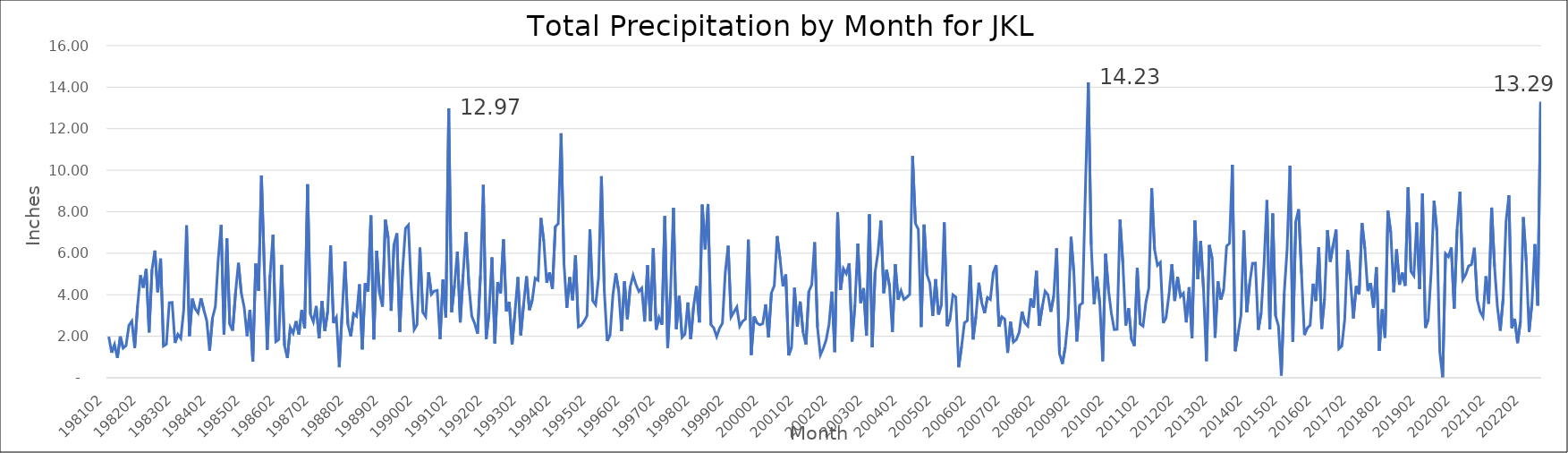
| Category | monthly_total |
|---|---|
| 198102.0 | 1.98 |
| 198103.0 | 1.21 |
| 198104.0 | 1.6 |
| 198105.0 | 0.96 |
| 198106.0 | 1.99 |
| 198107.0 | 1.43 |
| 198108.0 | 1.55 |
| 198109.0 | 2.53 |
| 198110.0 | 2.73 |
| 198111.0 | 1.44 |
| 198112.0 | 3.48 |
| 198201.0 | 4.94 |
| 198202.0 | 4.34 |
| 198203.0 | 5.24 |
| 198204.0 | 2.19 |
| 198205.0 | 5.2 |
| 198206.0 | 6.13 |
| 198207.0 | 4.12 |
| 198208.0 | 5.74 |
| 198209.0 | 1.53 |
| 198210.0 | 1.62 |
| 198211.0 | 3.62 |
| 198212.0 | 3.63 |
| 198301.0 | 1.68 |
| 198302.0 | 2.09 |
| 198303.0 | 1.9 |
| 198304.0 | 3.25 |
| 198305.0 | 7.34 |
| 198306.0 | 2.01 |
| 198307.0 | 3.81 |
| 198308.0 | 3.33 |
| 198309.0 | 3.12 |
| 198310.0 | 3.83 |
| 198311.0 | 3.27 |
| 198312.0 | 2.76 |
| 198401.0 | 1.31 |
| 198402.0 | 2.88 |
| 198403.0 | 3.43 |
| 198404.0 | 5.72 |
| 198405.0 | 7.36 |
| 198406.0 | 2.09 |
| 198407.0 | 6.71 |
| 198408.0 | 2.58 |
| 198409.0 | 2.27 |
| 198410.0 | 4.09 |
| 198411.0 | 5.54 |
| 198412.0 | 4.08 |
| 198501.0 | 3.4 |
| 198502.0 | 2.01 |
| 198503.0 | 3.27 |
| 198504.0 | 0.78 |
| 198505.0 | 5.5 |
| 198506.0 | 4.19 |
| 198507.0 | 9.74 |
| 198508.0 | 5.24 |
| 198509.0 | 1.35 |
| 198510.0 | 4.97 |
| 198511.0 | 6.89 |
| 198512.0 | 1.74 |
| 198601.0 | 1.84 |
| 198602.0 | 5.44 |
| 198603.0 | 1.56 |
| 198604.0 | 0.95 |
| 198605.0 | 2.42 |
| 198606.0 | 2.15 |
| 198607.0 | 2.73 |
| 198608.0 | 2.09 |
| 198609.0 | 3.27 |
| 198610.0 | 2.38 |
| 198611.0 | 9.32 |
| 198612.0 | 3.06 |
| 198701.0 | 2.7 |
| 198702.0 | 3.46 |
| 198703.0 | 1.9 |
| 198704.0 | 3.69 |
| 198705.0 | 2.25 |
| 198706.0 | 3.22 |
| 198707.0 | 6.37 |
| 198708.0 | 2.64 |
| 198709.0 | 2.91 |
| 198710.0 | 0.51 |
| 198711.0 | 3.15 |
| 198712.0 | 5.6 |
| 198801.0 | 2.57 |
| 198802.0 | 2 |
| 198803.0 | 3.09 |
| 198804.0 | 2.97 |
| 198805.0 | 4.5 |
| 198806.0 | 1.37 |
| 198807.0 | 4.56 |
| 198808.0 | 4.15 |
| 198809.0 | 7.82 |
| 198810.0 | 1.85 |
| 198811.0 | 6.12 |
| 198812.0 | 4.07 |
| 198901.0 | 3.43 |
| 198902.0 | 7.61 |
| 198903.0 | 6.73 |
| 198904.0 | 3.23 |
| 198905.0 | 6.43 |
| 198906.0 | 6.96 |
| 198907.0 | 2.21 |
| 198908.0 | 5.22 |
| 198909.0 | 7.2 |
| 198910.0 | 7.36 |
| 198911.0 | 4.28 |
| 198912.0 | 2.32 |
| 199001.0 | 2.56 |
| 199002.0 | 6.27 |
| 199003.0 | 3.16 |
| 199004.0 | 2.95 |
| 199005.0 | 5.08 |
| 199006.0 | 4.02 |
| 199007.0 | 4.18 |
| 199008.0 | 4.21 |
| 199009.0 | 1.86 |
| 199010.0 | 4.73 |
| 199011.0 | 2.91 |
| 199012.0 | 12.97 |
| 199101.0 | 3.16 |
| 199102.0 | 4.46 |
| 199103.0 | 6.08 |
| 199104.0 | 2.67 |
| 199105.0 | 4.99 |
| 199106.0 | 7.01 |
| 199107.0 | 4.46 |
| 199108.0 | 2.96 |
| 199109.0 | 2.62 |
| 199110.0 | 2.13 |
| 199111.0 | 4.9 |
| 199112.0 | 9.29 |
| 199201.0 | 1.87 |
| 199202.0 | 3.12 |
| 199203.0 | 5.8 |
| 199204.0 | 1.66 |
| 199205.0 | 4.61 |
| 199206.0 | 4.07 |
| 199207.0 | 6.67 |
| 199208.0 | 3.2 |
| 199209.0 | 3.66 |
| 199210.0 | 1.6 |
| 199211.0 | 3.17 |
| 199212.0 | 4.85 |
| 199301.0 | 2.05 |
| 199302.0 | 3.54 |
| 199303.0 | 4.89 |
| 199304.0 | 3.26 |
| 199305.0 | 3.74 |
| 199306.0 | 4.8 |
| 199307.0 | 4.7 |
| 199308.0 | 7.7 |
| 199309.0 | 6.58 |
| 199310.0 | 4.58 |
| 199311.0 | 5.08 |
| 199312.0 | 4.28 |
| 199401.0 | 7.28 |
| 199402.0 | 7.42 |
| 199403.0 | 11.78 |
| 199404.0 | 5.52 |
| 199405.0 | 3.37 |
| 199406.0 | 4.85 |
| 199407.0 | 3.74 |
| 199408.0 | 5.89 |
| 199409.0 | 2.45 |
| 199410.0 | 2.53 |
| 199411.0 | 2.73 |
| 199412.0 | 2.99 |
| 199501.0 | 7.15 |
| 199502.0 | 3.71 |
| 199503.0 | 3.51 |
| 199504.0 | 4.81 |
| 199505.0 | 9.71 |
| 199506.0 | 4.19 |
| 199507.0 | 1.77 |
| 199508.0 | 2.07 |
| 199509.0 | 4.01 |
| 199510.0 | 5.03 |
| 199511.0 | 4.18 |
| 199512.0 | 2.25 |
| 199601.0 | 4.64 |
| 199602.0 | 2.82 |
| 199603.0 | 4.39 |
| 199604.0 | 4.94 |
| 199605.0 | 4.49 |
| 199606.0 | 4.16 |
| 199607.0 | 4.32 |
| 199608.0 | 2.71 |
| 199609.0 | 5.42 |
| 199610.0 | 2.74 |
| 199611.0 | 6.25 |
| 199612.0 | 2.32 |
| 199701.0 | 2.9 |
| 199702.0 | 2.56 |
| 199703.0 | 7.79 |
| 199704.0 | 1.44 |
| 199705.0 | 4.15 |
| 199706.0 | 8.19 |
| 199707.0 | 2.35 |
| 199708.0 | 3.94 |
| 199709.0 | 1.95 |
| 199710.0 | 2.11 |
| 199711.0 | 3.63 |
| 199712.0 | 1.86 |
| 199801.0 | 3.45 |
| 199802.0 | 4.42 |
| 199803.0 | 2.67 |
| 199804.0 | 8.34 |
| 199805.0 | 6.19 |
| 199806.0 | 8.37 |
| 199807.0 | 2.56 |
| 199808.0 | 2.4 |
| 199809.0 | 1.98 |
| 199810.0 | 2.38 |
| 199811.0 | 2.63 |
| 199812.0 | 5.09 |
| 199901.0 | 6.36 |
| 199902.0 | 2.93 |
| 199903.0 | 3.17 |
| 199904.0 | 3.41 |
| 199905.0 | 2.48 |
| 199906.0 | 2.72 |
| 199907.0 | 2.83 |
| 199908.0 | 6.65 |
| 199909.0 | 1.1 |
| 199910.0 | 2.95 |
| 199911.0 | 2.64 |
| 199912.0 | 2.55 |
| 200001.0 | 2.611 |
| 200002.0 | 3.537 |
| 200003.0 | 1.945 |
| 200004.0 | 4.085 |
| 200005.0 | 4.435 |
| 200006.0 | 6.824 |
| 200007.0 | 5.723 |
| 200008.0 | 4.403 |
| 200009.0 | 4.974 |
| 200010.0 | 1.082 |
| 200011.0 | 1.476 |
| 200012.0 | 4.339 |
| 200101.0 | 2.47 |
| 200102.0 | 3.67 |
| 200103.0 | 2.19 |
| 200104.0 | 1.6 |
| 200105.0 | 4.15 |
| 200106.0 | 4.48 |
| 200107.0 | 6.53 |
| 200108.0 | 2.43 |
| 200109.0 | 1.1 |
| 200110.0 | 1.41 |
| 200111.0 | 1.82 |
| 200112.0 | 2.57 |
| 200201.0 | 4.15 |
| 200202.0 | 1.24 |
| 200203.0 | 7.97 |
| 200204.0 | 4.23 |
| 200205.0 | 5.26 |
| 200206.0 | 5.02 |
| 200207.0 | 5.52 |
| 200208.0 | 1.75 |
| 200209.0 | 3.51 |
| 200210.0 | 6.47 |
| 200211.0 | 3.6 |
| 200212.0 | 4.32 |
| 200301.0 | 2.04 |
| 200302.0 | 7.87 |
| 200303.0 | 1.47 |
| 200304.0 | 5.09 |
| 200305.0 | 6.03 |
| 200306.0 | 7.57 |
| 200307.0 | 4.08 |
| 200308.0 | 5.2 |
| 200309.0 | 4.42 |
| 200310.0 | 2.2 |
| 200311.0 | 5.47 |
| 200312.0 | 3.76 |
| 200401.0 | 4.19 |
| 200402.0 | 3.77 |
| 200403.0 | 3.88 |
| 200404.0 | 4.02 |
| 200405.0 | 10.68 |
| 200406.0 | 7.43 |
| 200407.0 | 7.15 |
| 200408.0 | 2.45 |
| 200409.0 | 7.38 |
| 200410.0 | 4.97 |
| 200411.0 | 4.56 |
| 200412.0 | 2.98 |
| 200501.0 | 4.75 |
| 200502.0 | 3.05 |
| 200503.0 | 3.51 |
| 200504.0 | 7.48 |
| 200505.0 | 2.49 |
| 200506.0 | 2.83 |
| 200507.0 | 4 |
| 200508.0 | 3.89 |
| 200509.0 | 0.51 |
| 200510.0 | 1.49 |
| 200511.0 | 2.65 |
| 200512.0 | 2.75 |
| 200601.0 | 5.42 |
| 200602.0 | 1.85 |
| 200603.0 | 2.96 |
| 200604.0 | 4.58 |
| 200605.0 | 3.62 |
| 200606.0 | 3.11 |
| 200607.0 | 3.87 |
| 200608.0 | 3.77 |
| 200609.0 | 5.06 |
| 200610.0 | 5.43 |
| 200611.0 | 2.46 |
| 200612.0 | 2.94 |
| 200701.0 | 2.83 |
| 200702.0 | 1.2 |
| 200703.0 | 2.7 |
| 200704.0 | 1.72 |
| 200705.0 | 1.84 |
| 200706.0 | 2.19 |
| 200707.0 | 3.19 |
| 200708.0 | 2.64 |
| 200709.0 | 2.49 |
| 200710.0 | 3.82 |
| 200711.0 | 3.38 |
| 200712.0 | 5.15 |
| 200801.0 | 2.5 |
| 200802.0 | 3.39 |
| 200803.0 | 4.17 |
| 200804.0 | 4 |
| 200805.0 | 3.18 |
| 200806.0 | 3.94 |
| 200807.0 | 6.24 |
| 200808.0 | 1.16 |
| 200809.0 | 0.67 |
| 200810.0 | 1.47 |
| 200811.0 | 2.87 |
| 200812.0 | 6.79 |
| 200901.0 | 5.04 |
| 200902.0 | 1.75 |
| 200903.0 | 3.5 |
| 200904.0 | 3.6 |
| 200905.0 | 9.11 |
| 200906.0 | 14.23 |
| 200907.0 | 6.42 |
| 200908.0 | 3.55 |
| 200909.0 | 4.88 |
| 200910.0 | 3.56 |
| 200911.0 | 0.8 |
| 200912.0 | 5.97 |
| 201001.0 | 4.24 |
| 201002.0 | 3.11 |
| 201003.0 | 2.32 |
| 201004.0 | 2.33 |
| 201005.0 | 7.62 |
| 201006.0 | 5.52 |
| 201007.0 | 2.52 |
| 201008.0 | 3.35 |
| 201009.0 | 1.85 |
| 201010.0 | 1.53 |
| 201011.0 | 5.3 |
| 201012.0 | 2.59 |
| 201101.0 | 2.49 |
| 201102.0 | 3.65 |
| 201103.0 | 4.32 |
| 201104.0 | 9.14 |
| 201105.0 | 6.18 |
| 201106.0 | 5.42 |
| 201107.0 | 5.56 |
| 201108.0 | 2.64 |
| 201109.0 | 2.91 |
| 201110.0 | 4.01 |
| 201111.0 | 5.47 |
| 201112.0 | 3.7 |
| 201201.0 | 4.862 |
| 201202.0 | 3.917 |
| 201203.0 | 4.075 |
| 201204.0 | 2.665 |
| 201205.0 | 4.364 |
| 201206.0 | 1.912 |
| 201207.0 | 7.574 |
| 201208.0 | 4.753 |
| 201209.0 | 6.583 |
| 201210.0 | 4.245 |
| 201211.0 | 0.802 |
| 201212.0 | 6.397 |
| 201301.0 | 5.735 |
| 201302.0 | 1.928 |
| 201303.0 | 4.641 |
| 201304.0 | 3.764 |
| 201305.0 | 4.255 |
| 201306.0 | 6.344 |
| 201307.0 | 6.476 |
| 201308.0 | 10.263 |
| 201309.0 | 1.283 |
| 201310.0 | 2.135 |
| 201311.0 | 3.014 |
| 201312.0 | 7.095 |
| 201401.0 | 3.158 |
| 201402.0 | 4.547 |
| 201403.0 | 5.513 |
| 201404.0 | 5.524 |
| 201405.0 | 2.313 |
| 201406.0 | 3.123 |
| 201407.0 | 5.483 |
| 201408.0 | 8.555 |
| 201409.0 | 2.343 |
| 201410.0 | 7.916 |
| 201411.0 | 2.987 |
| 201412.0 | 2.498 |
| 201501.0 | 0.11 |
| 201502.0 | 4.07 |
| 201503.0 | 6.18 |
| 201504.0 | 10.22 |
| 201505.0 | 1.74 |
| 201506.0 | 7.52 |
| 201507.0 | 8.12 |
| 201508.0 | 5.03 |
| 201509.0 | 2.06 |
| 201510.0 | 2.4 |
| 201511.0 | 2.53 |
| 201512.0 | 4.53 |
| 201601.0 | 3.7 |
| 201602.0 | 6.29 |
| 201603.0 | 2.36 |
| 201604.0 | 3.82 |
| 201605.0 | 7.11 |
| 201606.0 | 5.59 |
| 201607.0 | 6.4 |
| 201608.0 | 7.14 |
| 201609.0 | 1.4 |
| 201610.0 | 1.53 |
| 201611.0 | 2.81 |
| 201612.0 | 6.16 |
| 201701.0 | 4.72 |
| 201702.0 | 2.86 |
| 201703.0 | 4.42 |
| 201704.0 | 4.02 |
| 201705.0 | 7.46 |
| 201706.0 | 6.21 |
| 201707.0 | 4.18 |
| 201708.0 | 4.563 |
| 201709.0 | 3.364 |
| 201710.0 | 5.323 |
| 201711.0 | 1.304 |
| 201712.0 | 3.293 |
| 201801.0 | 1.93 |
| 201802.0 | 8.047 |
| 201803.0 | 7.001 |
| 201804.0 | 4.127 |
| 201805.0 | 6.186 |
| 201806.0 | 4.485 |
| 201807.0 | 5.063 |
| 201808.0 | 4.434 |
| 201809.0 | 9.175 |
| 201810.0 | 5.124 |
| 201811.0 | 4.92 |
| 201812.0 | 7.476 |
| 201901.0 | 4.267 |
| 201902.0 | 8.884 |
| 201903.0 | 2.406 |
| 201904.0 | 2.804 |
| 201905.0 | 5.075 |
| 201906.0 | 8.526 |
| 201907.0 | 7.054 |
| 201908.0 | 1.253 |
| 201909.0 | 0.001 |
| 201910.0 | 5.985 |
| 201911.0 | 5.834 |
| 201912.0 | 6.276 |
| 202001.0 | 3.338 |
| 202002.0 | 7.139 |
| 202003.0 | 8.966 |
| 202004.0 | 4.737 |
| 202005.0 | 4.976 |
| 202006.0 | 5.385 |
| 202007.0 | 5.452 |
| 202008.0 | 6.265 |
| 202009.0 | 3.772 |
| 202010.0 | 3.194 |
| 202011.0 | 2.932 |
| 202012.0 | 4.886 |
| 202101.0 | 3.568 |
| 202102.0 | 8.197 |
| 202103.0 | 5.363 |
| 202104.0 | 3.424 |
| 202105.0 | 2.267 |
| 202106.0 | 3.834 |
| 202107.0 | 7.533 |
| 202108.0 | 8.794 |
| 202109.0 | 2.394 |
| 202110.0 | 2.846 |
| 202111.0 | 1.672 |
| 202112.0 | 2.716 |
| 202201.0 | 7.736 |
| 202202.0 | 5.625 |
| 202203.0 | 2.214 |
| 202204.0 | 3.607 |
| 202205.0 | 6.435 |
| 202206.0 | 3.483 |
| 202207.0 | 13.295 |